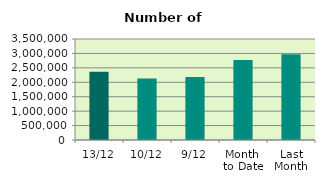
| Category | Series 0 |
|---|---|
| 13/12 | 2363756 |
| 10/12 | 2131012 |
| 9/12 | 2180354 |
| Month 
to Date | 2770982.667 |
| Last
Month | 2974168.364 |